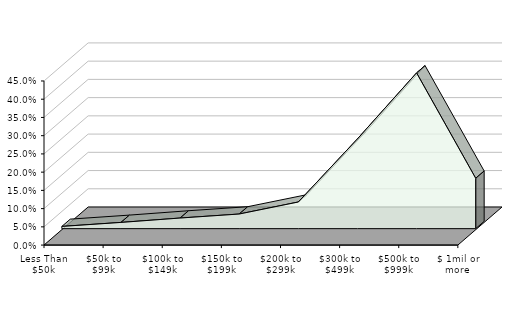
| Category | Westchester |
|---|---|
| Less Than $50k | 0.009 |
| $50k to $99k | 0.02 |
| $100k to $149k | 0.032 |
| $150k to $199k | 0.043 |
| $200k to $299k | 0.076 |
| $300k to $499k | 0.249 |
| $500k to $999k | 0.43 |
| $ 1mil or more | 0.141 |